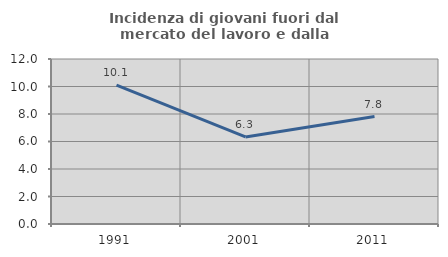
| Category | Incidenza di giovani fuori dal mercato del lavoro e dalla formazione  |
|---|---|
| 1991.0 | 10.101 |
| 2001.0 | 6.333 |
| 2011.0 | 7.814 |